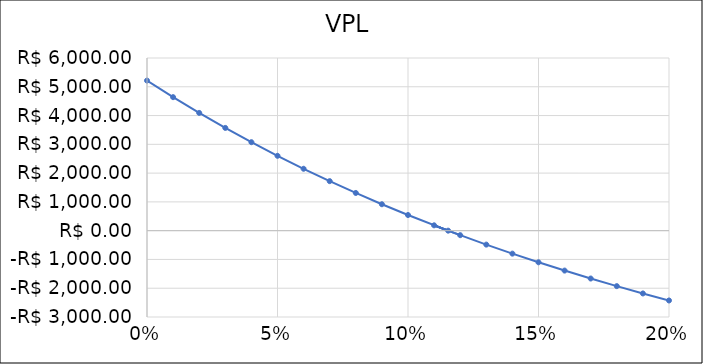
| Category | VPL |
|---|---|
| 0.0 | 5215 |
| 0.01 | 4639.354 |
| 0.02 | 4091.825 |
| 0.03 | 3570.725 |
| 0.04 | 3074.484 |
| 0.05 | 2601.64 |
| 0.06 | 2150.832 |
| 0.07 | 1720.792 |
| 0.08 | 1310.338 |
| 0.09 | 918.364 |
| 0.1 | 543.84 |
| 0.1153706 | 0.003 |
| 0.11 | 185.803 |
| 0.12 | -156.649 |
| 0.13 | -484.359 |
| 0.14 | -798.117 |
| 0.15 | -1098.662 |
| 0.16 | -1386.689 |
| 0.17 | -1662.849 |
| 0.18 | -1927.753 |
| 0.19 | -2181.975 |
| 0.2 | -2426.055 |